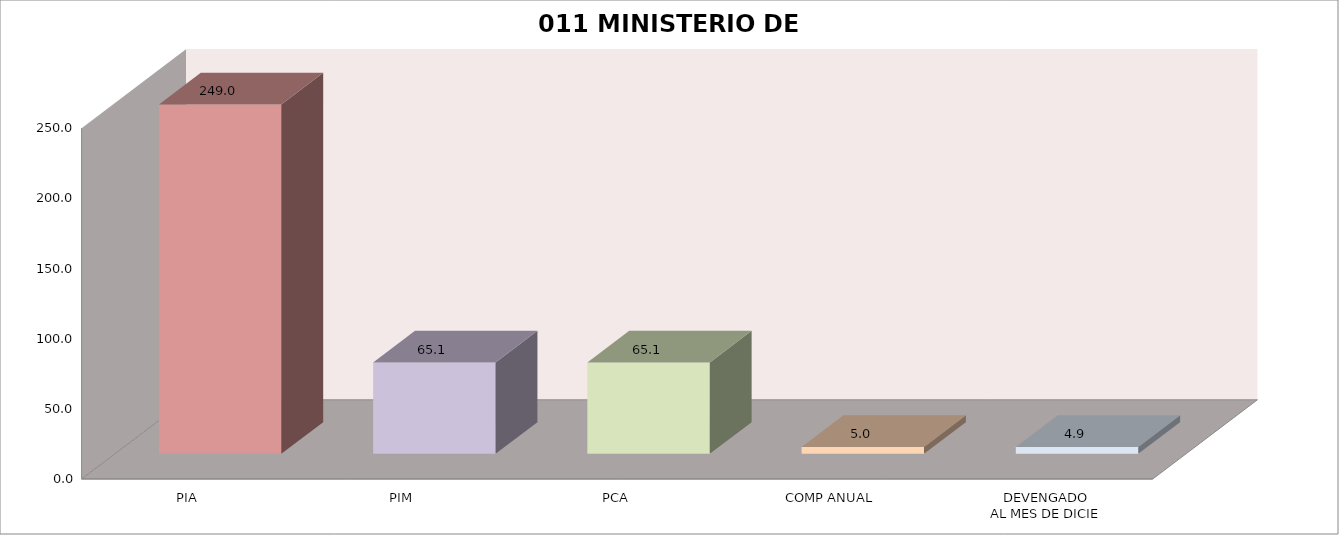
| Category | 011 MINISTERIO DE SALUD |
|---|---|
| PIA | 249.028 |
| PIM | 65.09 |
| PCA | 65.09 |
| COMP ANUAL | 4.953 |
| DEVENGADO
AL MES DE DICIE | 4.929 |